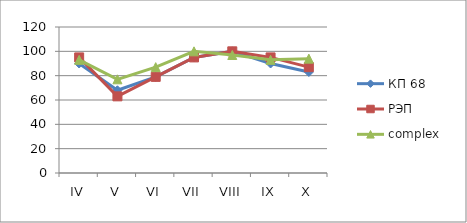
| Category | КП 68 | РЭП  | complex |
|---|---|---|---|
| IV | 90 | 95 | 93 |
| V | 68 | 63 | 77 |
| VI | 79 | 79 | 87 |
| VII | 95 | 95 | 100 |
| VIII | 100 | 100 | 97 |
| IX | 90 | 95 | 93 |
| X | 83 | 87 | 94 |